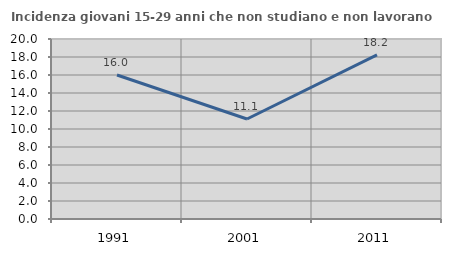
| Category | Incidenza giovani 15-29 anni che non studiano e non lavorano  |
|---|---|
| 1991.0 | 15.995 |
| 2001.0 | 11.111 |
| 2011.0 | 18.234 |